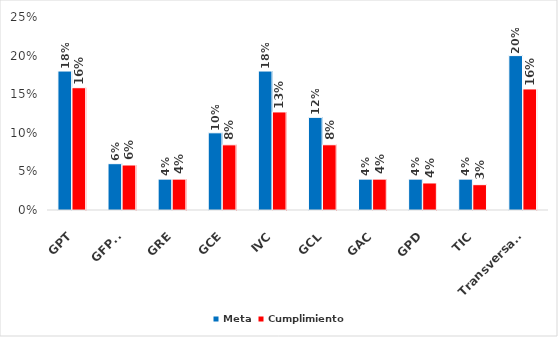
| Category | Meta | Cumplimiento |
|---|---|---|
| GPT | 0.18 | 0.158 |
| GFPFH | 0.06 | 0.058 |
| GRE | 0.04 | 0.04 |
| GCE | 0.1 | 0.084 |
| IVC | 0.18 | 0.127 |
| GCL | 0.12 | 0.084 |
| GAC | 0.04 | 0.04 |
| GPD | 0.04 | 0.035 |
| TIC | 0.04 | 0.033 |
| Transversales | 0.2 | 0.157 |